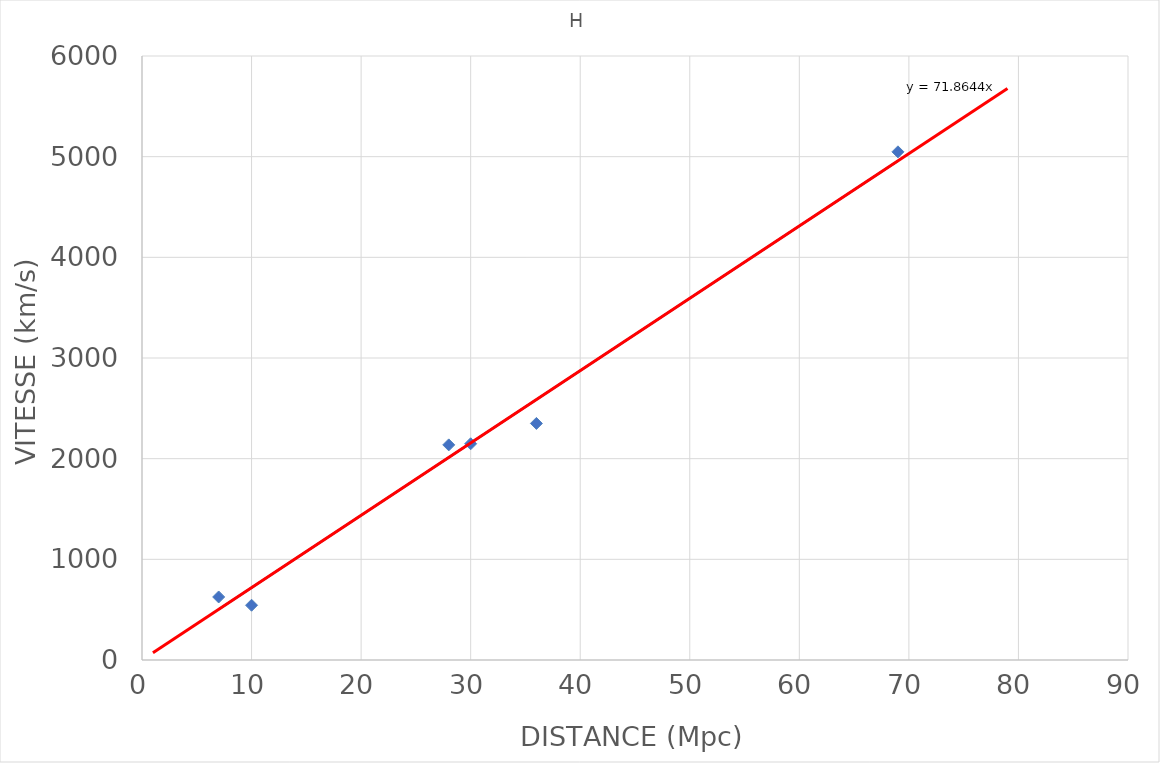
| Category | H |
|---|---|
| 30.0 | 2148 |
| 28.0 | 2137 |
| 36.0 | 2350 |
| 10.0 | 544 |
| 7.0 | 626 |
| 69.0 | 5048 |